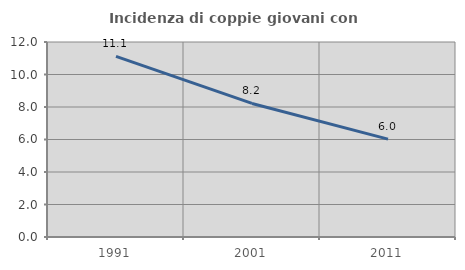
| Category | Incidenza di coppie giovani con figli |
|---|---|
| 1991.0 | 11.111 |
| 2001.0 | 8.219 |
| 2011.0 | 6.024 |